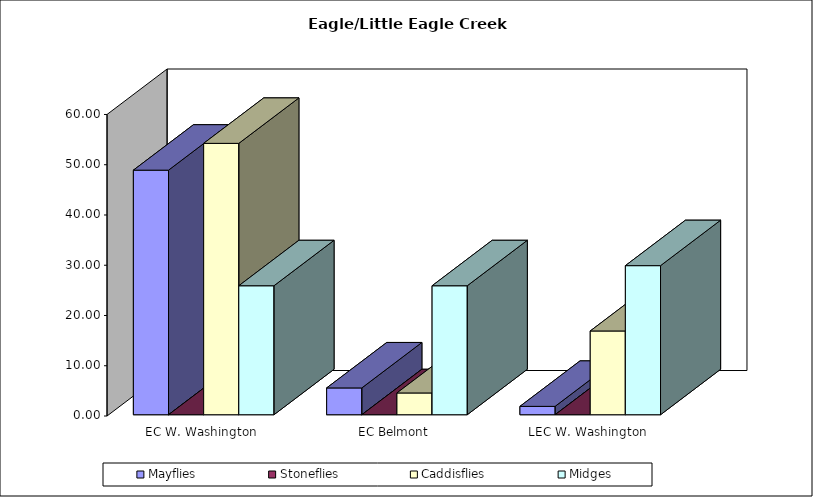
| Category | Mayflies | Stoneflies | Caddisflies | Midges |
|---|---|---|---|---|
| EC W. Washington | 48.667 | 0 | 54 | 25.667 |
| EC Belmont | 5.333 | 0 | 4.333 | 25.667 |
| LEC W. Washington | 1.667 | 0 | 16.667 | 29.667 |